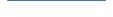
| Category | Series 0 |
|---|---|
| 0 | 41 |
| 1 | 46 |
| 2 | 41 |
| 3 | 30 |
| 4 | 55 |
| 5 | 40 |
| 6 | 46 |
| 7 | 34 |
| 8 | 68 |